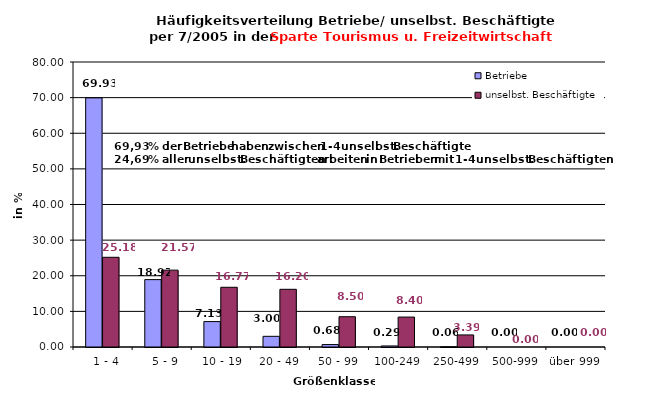
| Category | Betriebe | unselbst. Beschäftigte |
|---|---|---|
|   1 - 4 | 69.926 | 25.183 |
|   5 - 9 | 18.915 | 21.572 |
|  10 - 19 | 7.132 | 16.765 |
| 20 - 49 | 2.996 | 16.197 |
| 50 - 99 | 0.68 | 8.497 |
| 100-249 | 0.294 | 8.401 |
| 250-499 | 0.055 | 3.386 |
| 500-999 | 0 | 0 |
| über 999 | 0 | 0 |